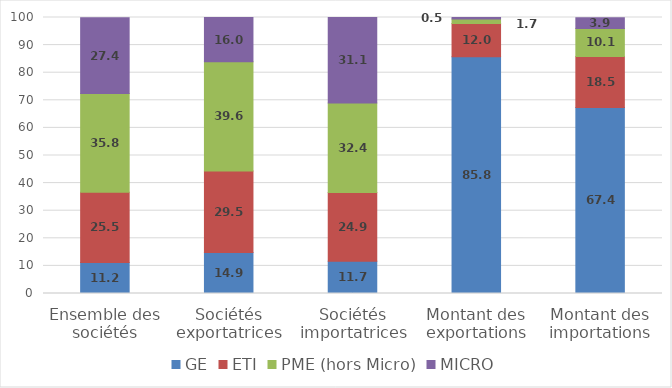
| Category | GE | ETI | PME (hors Micro) | MICRO |
|---|---|---|---|---|
| Ensemble des sociétés | 11.2 | 25.5 | 35.8 | 27.4 |
| Sociétés exportatrices | 14.9 | 29.5 | 39.6 | 16 |
| Sociétés importatrices | 11.7 | 24.9 | 32.4 | 31.1 |
| Montant des exportations | 85.8 | 12 | 1.7 | 0.5 |
| Montant des importations | 67.4 | 18.5 | 10.1 | 3.9 |